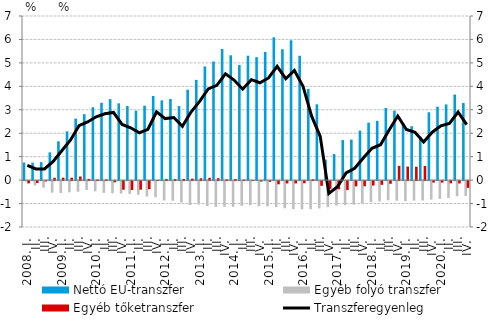
| Category | Nettó EU-transzfer | Egyéb folyó transzfer | Egyéb tőketranszfer |
|---|---|---|---|
| 2008. I. | 0.751 | -0.024 | -0.097 |
|          II. | 0.744 | -0.185 | -0.082 |
|          III. | 0.767 | -0.28 | -0.013 |
|          IV. | 1.184 | -0.492 | 0.103 |
| 2009. I. | 1.657 | -0.508 | 0.104 |
|          II. | 2.079 | -0.478 | 0.104 |
|          III. | 2.623 | -0.454 | 0.154 |
|          IV. | 2.81 | -0.383 | 0.054 |
| 2010. I. | 3.109 | -0.433 | 0.026 |
|          II. | 3.3 | -0.499 | 0.028 |
|          III. | 3.453 | -0.516 | -0.051 |
|          IV. | 3.273 | -0.531 | -0.368 |
| 2011. I. | 3.158 | -0.545 | -0.38 |
|          II. | 2.962 | -0.583 | -0.365 |
|          III. | 3.173 | -0.657 | -0.347 |
|          IV. | 3.589 | -0.687 | 0.007 |
| 2012. I. | 3.401 | -0.827 | 0.051 |
|          II. | 3.46 | -0.836 | 0.045 |
|          III. | 3.158 | -0.914 | 0.053 |
|          IV. | 3.857 | -1.019 | 0.064 |
| 2013. I. | 4.276 | -0.994 | 0.079 |
| II. | 4.849 | -1.061 | 0.099 |
|          III. | 5.058 | -1.097 | 0.081 |
| IV. | 5.594 | -1.097 | 0.034 |
| 2014. I. | 5.324 | -1.099 | 0.044 |
| II. | 4.915 | -1.057 | 0.021 |
|          III. | 5.307 | -1.024 | 0 |
| IV. | 5.245 | -1.073 | -0.019 |
| 2015. I. | 5.465 | -1.078 | -0.029 |
| II. | 6.092 | -1.107 | -0.136 |
|          III. | 5.581 | -1.157 | -0.1 |
| IV. | 5.965 | -1.19 | -0.099 |
| 2016. I. | 5.304 | -1.207 | -0.092 |
| II. | 3.89 | -1.201 | 0.037 |
|          III. | 3.233 | -1.163 | -0.201 |
| IV. | 0.873 | -1.112 | -0.331 |
| 2017. I. | 1.11 | -1.044 | -0.35 |
| II. | 1.708 | -1.023 | -0.381 |
|          III. | 1.729 | -1.004 | -0.223 |
| IV. | 2.112 | -0.95 | -0.219 |
| 2018. I. | 2.453 | -0.904 | -0.19 |
| II. | 2.529 | -0.863 | -0.158 |
|          III. | 3.077 | -0.822 | -0.114 |
| IV. | 2.963 | -0.836 | 0.61 |
| 2019. I. | 2.435 | -0.858 | 0.579 |
| II. | 2.299 | -0.831 | 0.571 |
|          III. | 1.855 | -0.826 | 0.601 |
| IV. | 2.895 | -0.788 | -0.062 |
| 2020. I. | 3.131 | -0.757 | -0.062 |
| II. | 3.231 | -0.718 | -0.093 |
|          III. | 3.651 | -0.647 | -0.099 |
| IV. | 3.292 | -0.636 | -0.287 |